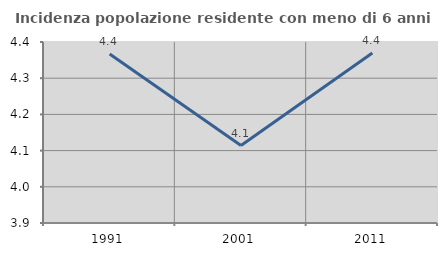
| Category | Incidenza popolazione residente con meno di 6 anni |
|---|---|
| 1991.0 | 4.367 |
| 2001.0 | 4.114 |
| 2011.0 | 4.37 |